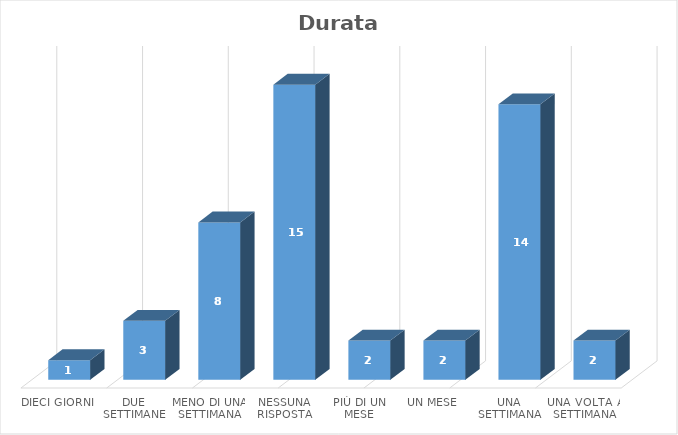
| Category | Series 0 |
|---|---|
| Dieci giorni | 1 |
| Due settimane | 3 |
| Meno di una settimana | 8 |
| Nessuna risposta | 15 |
| Più di un mese | 2 |
| Un mese | 2 |
| Una settimana | 14 |
| Una volta a settimana | 2 |